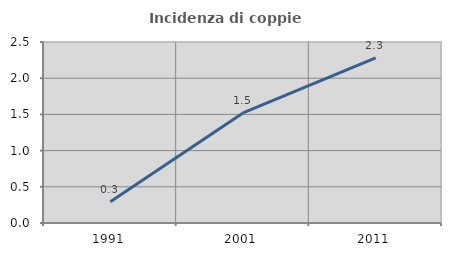
| Category | Incidenza di coppie miste |
|---|---|
| 1991.0 | 0.292 |
| 2001.0 | 1.52 |
| 2011.0 | 2.281 |